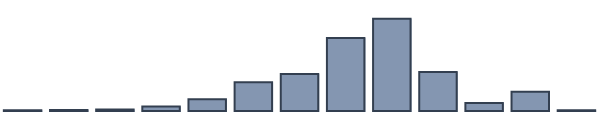
| Category | Series 0 |
|---|---|
| 0 | 0.2 |
| 1 | 0.3 |
| 2 | 0.5 |
| 3 | 1.4 |
| 4 | 3.7 |
| 5 | 9.1 |
| 6 | 11.7 |
| 7 | 23 |
| 8 | 29.1 |
| 9 | 12.3 |
| 10 | 2.5 |
| 11 | 6.1 |
| 12 | 0.2 |